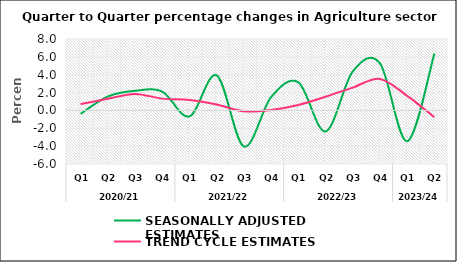
| Category | SEASONALLY ADJUSTED ESTIMATES | TREND CYCLE ESTIMATES |
|---|---|---|
| 0 | -0.379 | 0.712 |
| 1 | 1.563 | 1.313 |
| 2 | 2.199 | 1.85 |
| 3 | 2.109 | 1.322 |
| 4 | -0.675 | 1.164 |
| 5 | 3.928 | 0.66 |
| 6 | -4.041 | -0.104 |
| 7 | 1.49 | 0.057 |
| 8 | 3.154 | 0.61 |
| 9 | -2.357 | 1.533 |
| 10 | 4.364 | 2.559 |
| 11 | 5.27 | 3.533 |
| 12 | -3.452 | 1.628 |
| 13 | 6.366 | -0.75 |